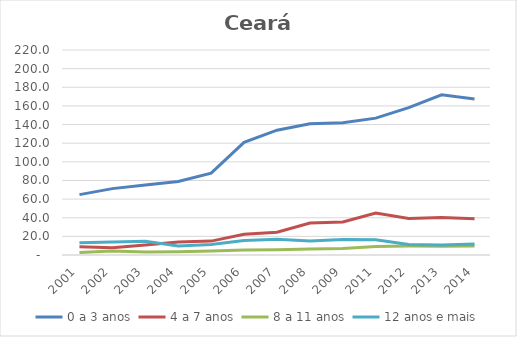
| Category | 0 a 3 anos | 4 a 7 anos | 8 a 11 anos | 12 anos e mais |
|---|---|---|---|---|
| 2001.0 | 64.811 | 8.77 | 2.805 | 13.158 |
| 2002.0 | 71.233 | 7.908 | 4.245 | 13.978 |
| 2003.0 | 75.216 | 10.749 | 3.09 | 14.793 |
| 2004.0 | 78.849 | 13.86 | 3.622 | 9.671 |
| 2005.0 | 87.884 | 14.893 | 4.232 | 11.345 |
| 2006.0 | 120.845 | 22.351 | 5.471 | 15.446 |
| 2007.0 | 133.959 | 24.342 | 5.743 | 16.996 |
| 2008.0 | 140.948 | 34.253 | 6.335 | 14.95 |
| 2009.0 | 141.878 | 35.504 | 6.964 | 16.711 |
| 2011.0 | 146.902 | 45.057 | 9.025 | 16.268 |
| 2012.0 | 158.203 | 39.208 | 9.543 | 11.385 |
| 2013.0 | 171.873 | 40.279 | 9.379 | 10.862 |
| 2014.0 | 167.435 | 38.911 | 9.621 | 11.832 |